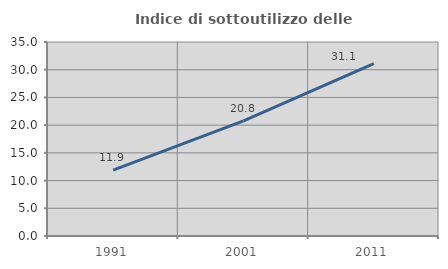
| Category | Indice di sottoutilizzo delle abitazioni  |
|---|---|
| 1991.0 | 11.9 |
| 2001.0 | 20.78 |
| 2011.0 | 31.119 |